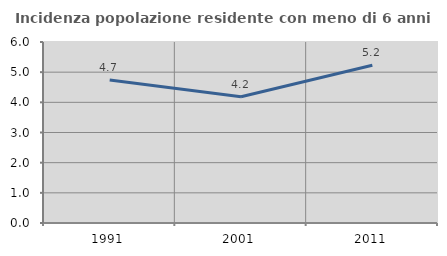
| Category | Incidenza popolazione residente con meno di 6 anni |
|---|---|
| 1991.0 | 4.738 |
| 2001.0 | 4.187 |
| 2011.0 | 5.231 |